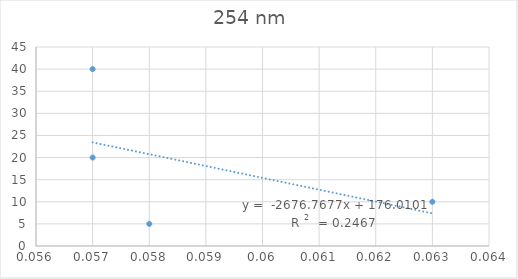
| Category | Series 0 |
|---|---|
| 0.058 | 5 |
| 0.063 | 10 |
| 0.057 | 20 |
| 0.057 | 40 |